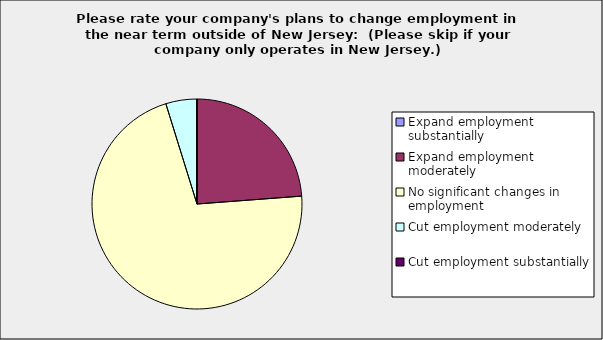
| Category | Series 0 |
|---|---|
| Expand employment substantially | 0 |
| Expand employment moderately | 0.238 |
| No significant changes in employment | 0.714 |
| Cut employment moderately | 0.048 |
| Cut employment substantially | 0 |